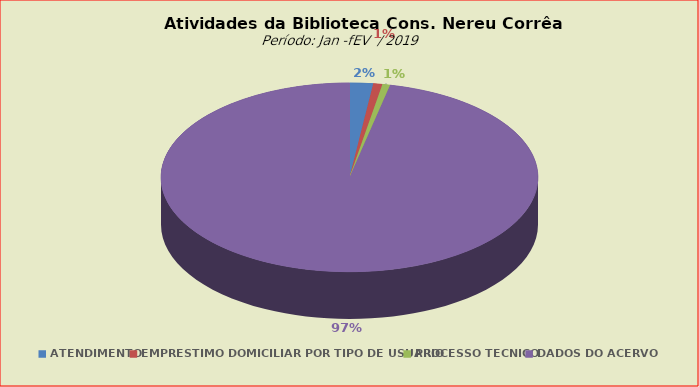
| Category | Series 0 |
|---|---|
| ATENDIMENTO | 1091 |
| EMPRÉSTIMO DOMICILIAR POR TIPO DE USUÁRIO | 421 |
| PROCESSO TÉCNICO | 362 |
| DADOS DO ACERVO | 52464 |